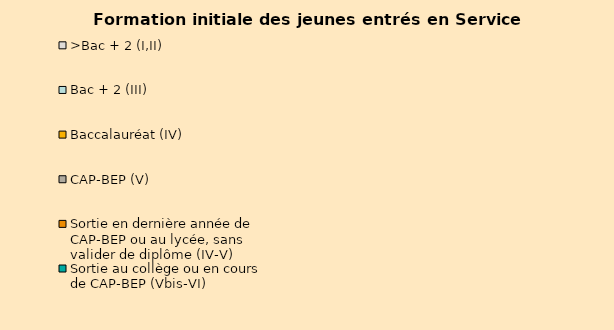
| Category | Sortie au collège ou en cours de CAP-BEP (Vbis-VI) | Sortie en dernière année de CAP-BEP ou au lycée, sans valider de diplôme (IV-V) | CAP-BEP (V) | Baccalauréat (IV) | Bac + 2 (III) | >Bac + 2 (I,II) |
|---|---|---|---|---|---|---|
| 2011.0 | 0.11 | 0.117 | 0.002 | 0.356 | 0.416 | 0 |
| 2012.0 | 0.118 | 0.084 | 0.045 | 0.335 | 0.244 | 0.174 |
| 2013.0 | 0.081 | 0.1 | 0.072 | 0.317 | 0.174 | 0.256 |
| 2014.0 | 0.063 | 0.113 | 0.062 | 0.338 | 0.158 | 0.266 |
| 2015.0 | 0.061 | 0.115 | 0.069 | 0.364 | 0.153 | 0.238 |
| 2016.0 | 0.057 | 0.119 | 0.077 | 0.398 | 0.141 | 0.208 |